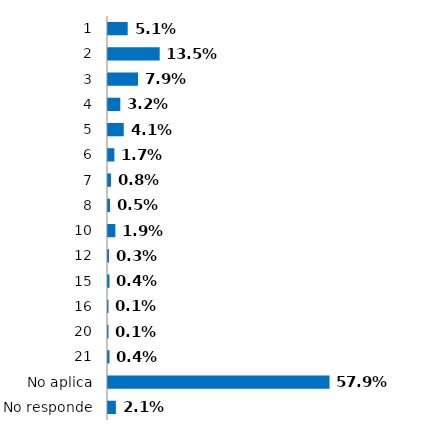
| Category | Series 0 |
|---|---|
| 1 | 0.051 |
| 2 | 0.135 |
| 3 | 0.079 |
| 4 | 0.032 |
| 5 | 0.041 |
| 6 | 0.017 |
| 7 | 0.008 |
| 8 | 0.005 |
| 10 | 0.019 |
| 12 | 0.003 |
| 15 | 0.004 |
| 16 | 0.001 |
| 20 | 0.001 |
| 21 | 0.004 |
| No aplica | 0.579 |
| No responde | 0.021 |